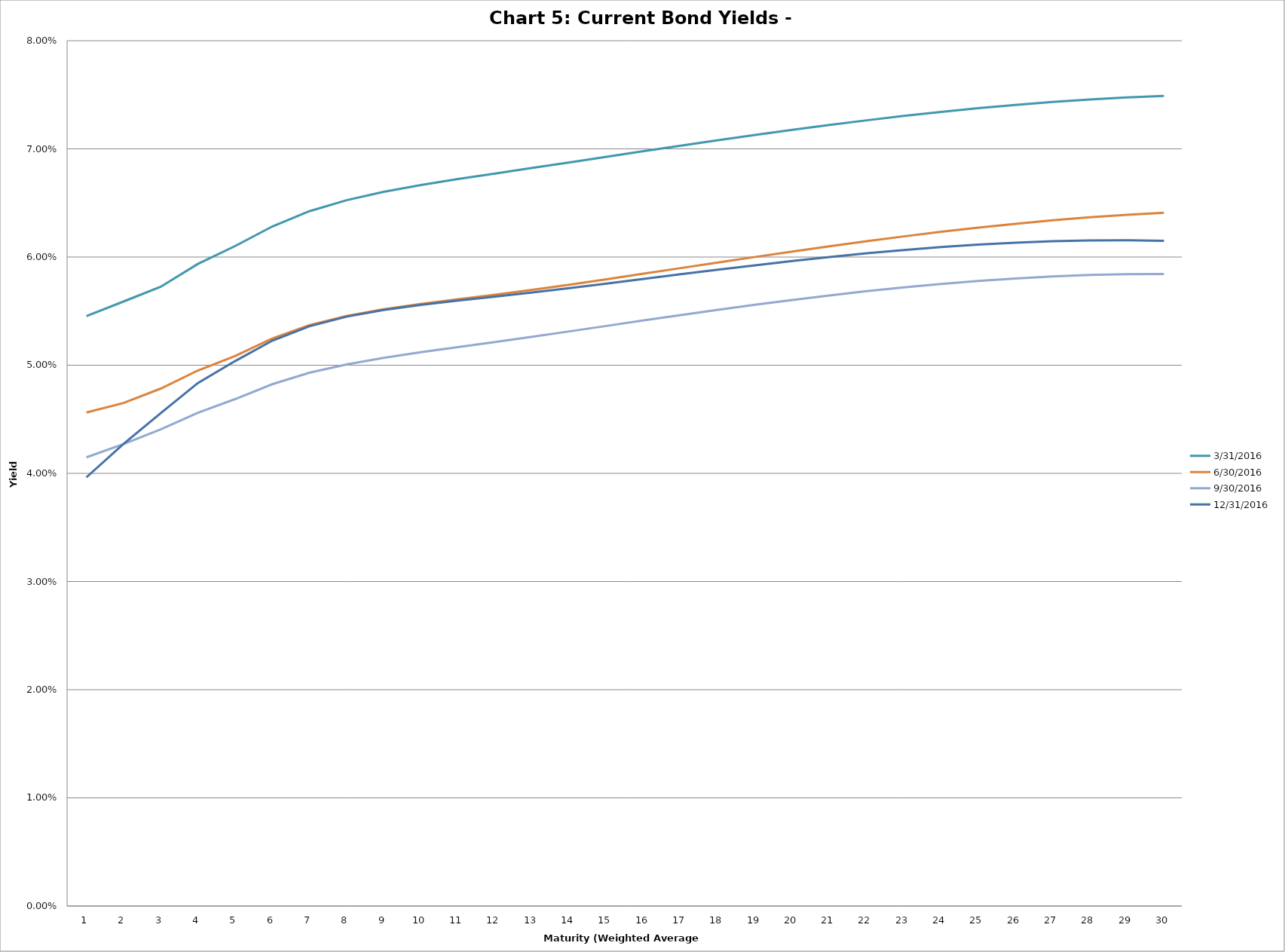
| Category | 3/31/2016 | 6/30/2016 | 9/30/2016 | 12/31/2016 |
|---|---|---|---|---|
| 0 | 0.055 | 0.046 | 0.041 | 0.04 |
| 1 | 0.056 | 0.047 | 0.043 | 0.043 |
| 2 | 0.057 | 0.048 | 0.044 | 0.046 |
| 3 | 0.059 | 0.05 | 0.046 | 0.048 |
| 4 | 0.061 | 0.051 | 0.047 | 0.05 |
| 5 | 0.063 | 0.052 | 0.048 | 0.052 |
| 6 | 0.064 | 0.054 | 0.049 | 0.054 |
| 7 | 0.065 | 0.055 | 0.05 | 0.054 |
| 8 | 0.066 | 0.055 | 0.051 | 0.055 |
| 9 | 0.067 | 0.056 | 0.051 | 0.056 |
| 10 | 0.067 | 0.056 | 0.052 | 0.056 |
| 11 | 0.068 | 0.057 | 0.052 | 0.056 |
| 12 | 0.068 | 0.057 | 0.053 | 0.057 |
| 13 | 0.069 | 0.057 | 0.053 | 0.057 |
| 14 | 0.069 | 0.058 | 0.054 | 0.058 |
| 15 | 0.07 | 0.058 | 0.054 | 0.058 |
| 16 | 0.07 | 0.059 | 0.055 | 0.058 |
| 17 | 0.071 | 0.059 | 0.055 | 0.059 |
| 18 | 0.071 | 0.06 | 0.056 | 0.059 |
| 19 | 0.072 | 0.061 | 0.056 | 0.06 |
| 20 | 0.072 | 0.061 | 0.056 | 0.06 |
| 21 | 0.073 | 0.061 | 0.057 | 0.06 |
| 22 | 0.073 | 0.062 | 0.057 | 0.061 |
| 23 | 0.073 | 0.062 | 0.058 | 0.061 |
| 24 | 0.074 | 0.063 | 0.058 | 0.061 |
| 25 | 0.074 | 0.063 | 0.058 | 0.061 |
| 26 | 0.074 | 0.063 | 0.058 | 0.061 |
| 27 | 0.075 | 0.064 | 0.058 | 0.062 |
| 28 | 0.075 | 0.064 | 0.058 | 0.062 |
| 29 | 0.075 | 0.064 | 0.058 | 0.062 |